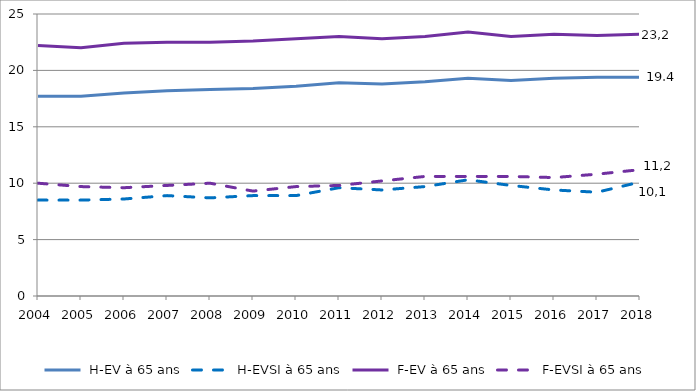
| Category | Series 0 | Series 1 | Series 2 | Series 3 |
|---|---|---|---|---|
| 2004.0 | 17.7 | 8.5 | 22.2 | 10 |
| 2005.0 | 17.7 | 8.5 | 22 | 9.7 |
| 2006.0 | 18 | 8.6 | 22.4 | 9.6 |
| 2007.0 | 18.2 | 8.9 | 22.5 | 9.8 |
| 2008.0 | 18.3 | 8.7 | 22.5 | 10 |
| 2009.0 | 18.4 | 8.9 | 22.6 | 9.3 |
| 2010.0 | 18.6 | 8.9 | 22.8 | 9.7 |
| 2011.0 | 18.9 | 9.6 | 23 | 9.8 |
| 2012.0 | 18.8 | 9.4 | 22.8 | 10.2 |
| 2013.0 | 19 | 9.7 | 23 | 10.6 |
| 2014.0 | 19.3 | 10.3 | 23.4 | 10.6 |
| 2015.0 | 19.1 | 9.8 | 23 | 10.6 |
| 2016.0 | 19.3 | 9.4 | 23.2 | 10.5 |
| 2017.0 | 19.4 | 9.2 | 23.1 | 10.8 |
| 2018.0 | 19.4 | 10.1 | 23.2 | 11.2 |